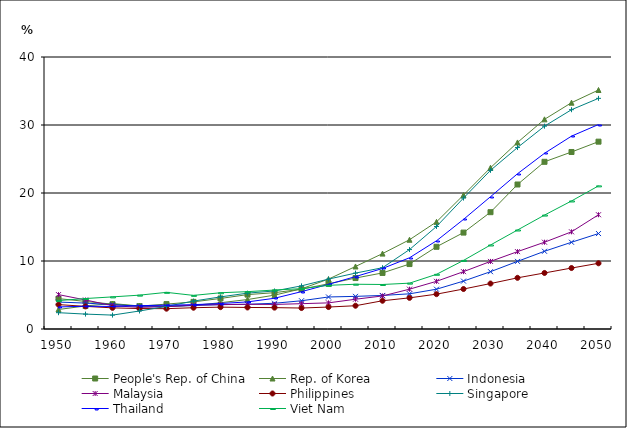
| Category | People's Rep. of China | Rep. of Korea | Indonesia | Malaysia | Philippines | Singapore | Thailand | Viet Nam |
|---|---|---|---|---|---|---|---|---|
| 1950.0 | 4.469 | 2.868 | 3.96 | 5.056 | 3.589 | 2.397 | 3.245 | 4.178 |
| 1955.0 | 4.053 | 3.391 | 3.808 | 4.268 | 3.325 | 2.192 | 3.348 | 4.479 |
| 1960.0 | 3.65 | 3.741 | 3.584 | 3.429 | 3.109 | 2.044 | 3.315 | 4.722 |
| 1965.0 | 3.357 | 3.384 | 3.349 | 3.186 | 3.007 | 2.647 | 3.433 | 4.979 |
| 1970.0 | 3.662 | 3.316 | 3.316 | 3.273 | 2.989 | 3.326 | 3.501 | 5.386 |
| 1975.0 | 3.987 | 3.476 | 3.45 | 3.524 | 3.13 | 4.108 | 3.578 | 4.942 |
| 1980.0 | 4.493 | 3.862 | 3.587 | 3.58 | 3.213 | 4.72 | 3.746 | 5.33 |
| 1985.0 | 5.058 | 4.332 | 3.634 | 3.635 | 3.167 | 5.274 | 3.983 | 5.492 |
| 1990.0 | 5.342 | 4.98 | 3.785 | 3.611 | 3.142 | 5.592 | 4.518 | 5.729 |
| 1995.0 | 5.851 | 5.91 | 4.154 | 3.723 | 3.083 | 6.344 | 5.492 | 5.932 |
| 2000.0 | 6.651 | 7.337 | 4.709 | 3.842 | 3.229 | 7.337 | 6.565 | 6.424 |
| 2005.0 | 7.492 | 9.194 | 4.799 | 4.379 | 3.423 | 8.221 | 7.71 | 6.582 |
| 2010.0 | 8.246 | 11.089 | 4.934 | 4.86 | 4.154 | 9.011 | 8.899 | 6.545 |
| 2015.0 | 9.551 | 13.127 | 5.174 | 5.855 | 4.58 | 11.681 | 10.472 | 6.741 |
| 2020.0 | 12.09 | 15.754 | 5.852 | 7.012 | 5.126 | 15.076 | 12.974 | 8.042 |
| 2025.0 | 14.178 | 19.701 | 7.043 | 8.434 | 5.879 | 19.254 | 16.116 | 10.087 |
| 2030.0 | 17.179 | 23.714 | 8.428 | 9.938 | 6.684 | 23.333 | 19.454 | 12.354 |
| 2035.0 | 21.252 | 27.435 | 9.945 | 11.378 | 7.525 | 26.685 | 22.832 | 14.558 |
| 2040.0 | 24.587 | 30.834 | 11.429 | 12.764 | 8.24 | 29.828 | 25.841 | 16.752 |
| 2045.0 | 26.031 | 33.282 | 12.757 | 14.291 | 8.966 | 32.249 | 28.361 | 18.828 |
| 2050.0 | 27.55 | 35.145 | 14.037 | 16.802 | 9.664 | 33.918 | 30.073 | 21.048 |